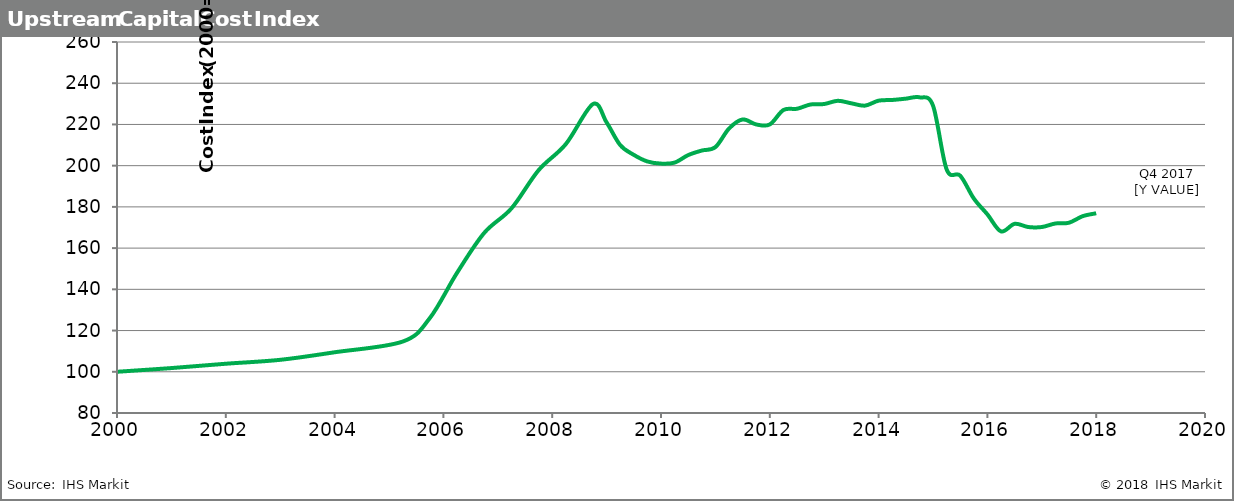
| Category | UCCI |
|---|---|
| 2000.0 | 100 |
| 2001.0 | 101.8 |
| 2002.0 | 103.9 |
| 2003.0 | 105.8 |
| 2004.0 | 109.462 |
| 2005.25 | 114.642 |
| 2005.75 | 126.023 |
| 2006.25 | 147.973 |
| 2006.75 | 167.369 |
| 2007.25 | 179.244 |
| 2007.75 | 197.8 |
| 2008.25 | 210.45 |
| 2008.75 | 229.896 |
| 2009.0 | 221 |
| 2009.25 | 210 |
| 2009.5 | 205.236 |
| 2009.75 | 202.036 |
| 2010.0 | 201 |
| 2010.25 | 201.483 |
| 2010.5 | 205.14 |
| 2010.75 | 207.332 |
| 2011.0 | 209 |
| 2011.25 | 218 |
| 2011.5 | 222.425 |
| 2011.75 | 220 |
| 2012.0 | 220 |
| 2012.25 | 227 |
| 2012.5 | 227.609 |
| 2012.75 | 229.683 |
| 2013.0 | 229.912 |
| 2013.25 | 231.471 |
| 2013.5 | 230.245 |
| 2013.75 | 229.132 |
| 2014.0 | 231.54 |
| 2014.25 | 231.871 |
| 2014.5 | 232.505 |
| 2014.75 | 233.169 |
| 2015.0 | 229.139 |
| 2015.25 | 198.243 |
| 2015.5 | 195.148 |
| 2015.75 | 184.075 |
| 2016.0 | 176.374 |
| 2016.25 | 168.112 |
| 2016.5 | 171.777 |
| 2016.75 | 170.234 |
| 2017.0 | 170.229 |
| 2017.25 | 171.948 |
| 2017.5 | 172.316 |
| 2017.75 | 175.477 |
| 2018.0 | 176.905 |